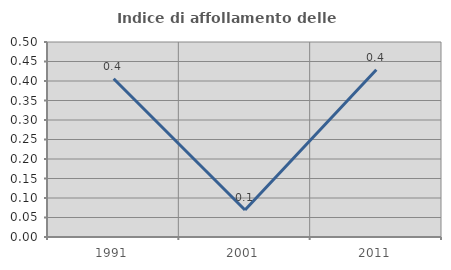
| Category | Indice di affollamento delle abitazioni  |
|---|---|
| 1991.0 | 0.406 |
| 2001.0 | 0.069 |
| 2011.0 | 0.429 |